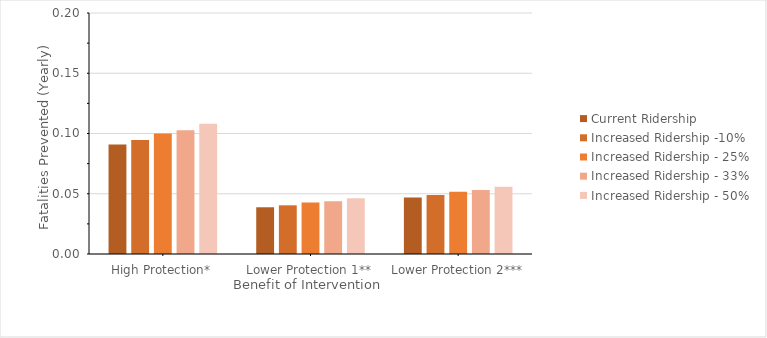
| Category | Current Ridership | Increased Ridership -10% | Increased Ridership - 25% | Increased Ridership - 33% | Increased Ridership - 50% |
|---|---|---|---|---|---|
| High Protection* | 0.091 | 0.095 | 0.1 | 0.103 | 0.108 |
| Lower Protection 1** | 0.039 | 0.04 | 0.043 | 0.044 | 0.046 |
| Lower Protection 2*** | 0.047 | 0.049 | 0.052 | 0.053 | 0.056 |